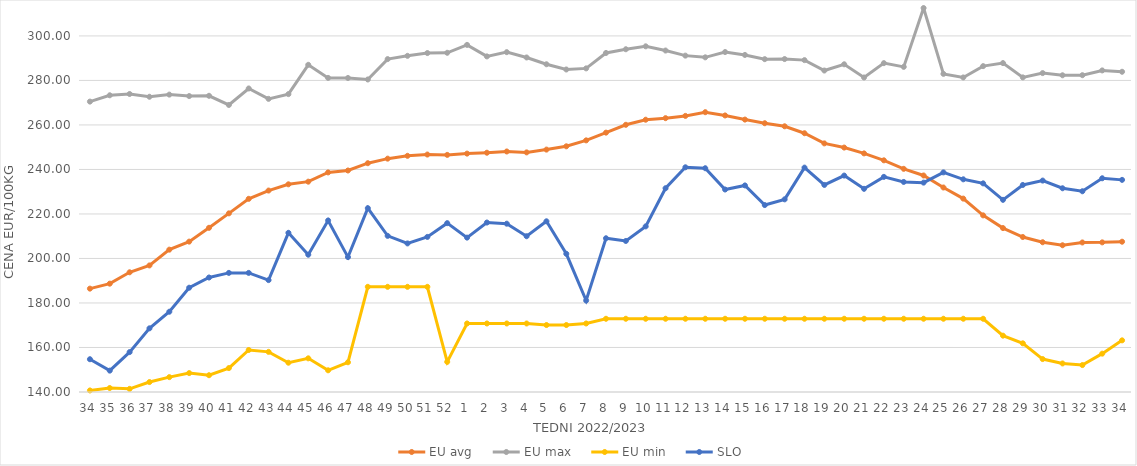
| Category | EU avg | EU max | EU min | SLO |
|---|---|---|---|---|
| 34.0 | 186.448 | 270.49 | 140.7 | 154.73 |
| 35.0 | 188.684 | 273.33 | 141.78 | 149.6 |
| 36.0 | 193.792 | 273.91 | 141.41 | 157.93 |
| 37.0 | 196.877 | 272.67 | 144.47 | 168.61 |
| 38.0 | 203.962 | 273.63 | 146.68 | 176.07 |
| 39.0 | 207.574 | 272.98 | 148.499 | 186.86 |
| 40.0 | 213.785 | 273.1 | 147.54 | 191.45 |
| 41.0 | 220.272 | 268.98 | 150.75 | 193.52 |
| 42.0 | 226.803 | 276.39 | 158.87 | 193.52 |
| 43.0 | 230.521 | 271.72 | 158.04 | 190.28 |
| 44.0 | 233.325 | 273.856 | 153.16 | 211.53 |
| 45.0 | 234.517 | 287.021 | 155.13 | 201.69 |
| 46.0 | 238.669 | 281.133 | 149.75 | 217.08 |
| 47.0 | 239.534 | 281.102 | 153.36 | 200.62 |
| 48.0 | 242.81 | 280.434 | 187.26 | 222.61 |
| 49.0 | 244.854 | 289.585 | 187.26 | 210.16 |
| 50.0 | 246.132 | 291.057 | 187.26 | 206.76 |
| 51.0 | 246.705 | 292.307 | 187.26 | 209.69 |
| 52.0 | 246.546 | 292.426 | 153.54 | 215.87 |
| 1.0 | 247.118 | 295.98 | 170.79 | 209.37 |
| 2.0 | 247.516 | 290.8 | 170.79 | 216.15 |
| 3.0 | 248.079 | 292.71 | 170.79 | 215.63 |
| 4.0 | 247.672 | 290.32 | 170.79 | 210 |
| 5.0 | 248.924 | 287.27 | 170.09 | 216.7 |
| 6.0 | 250.4 | 284.92 | 170.09 | 202.1 |
| 7.0 | 253.074 | 285.42 | 170.79 | 181.11 |
| 8.0 | 256.543 | 292.35 | 172.91 | 209.08 |
| 9.0 | 260.066 | 294.02 | 172.91 | 207.87 |
| 10.0 | 262.352 | 295.33 | 172.91 | 214.42 |
| 11.0 | 263.049 | 293.44 | 172.91 | 231.56 |
| 12.0 | 264.068 | 291.15 | 172.91 | 240.97 |
| 13.0 | 265.73 | 290.38 | 172.91 | 240.55 |
| 14.0 | 264.262 | 292.763 | 172.91 | 230.99 |
| 15.0 | 262.411 | 291.46 | 172.91 | 232.82 |
| 16.0 | 260.77 | 289.56 | 172.91 | 224 |
| 17.0 | 259.395 | 289.61 | 172.91 | 226.57 |
| 18.0 | 256.275 | 289.13 | 172.91 | 240.83 |
| 19.0 | 251.716 | 284.45 | 172.91 | 233.05 |
| 20.0 | 249.836 | 287.26 | 172.91 | 237.25 |
| 21.0 | 247.212 | 281.33 | 172.91 | 231.3 |
| 22.0 | 244.103 | 287.77 | 172.91 | 236.67 |
| 23.0 | 240.279 | 286.1 | 172.91 | 234.39 |
| 24.0 | 237.289 | 312.54 | 172.91 | 234.08 |
| 25.0 | 231.895 | 282.95 | 172.91 | 238.69 |
| 26.0 | 226.903 | 281.34 | 172.91 | 235.57 |
| 27.0 | 219.368 | 286.43 | 172.91 | 233.75 |
| 28.0 | 213.659 | 287.8 | 165.32 | 226.35 |
| 29.0 | 209.648 | 281.37 | 161.87 | 233.03 |
| 30.0 | 207.297 | 283.3 | 154.8 | 235 |
| 31.0 | 205.939 | 282.32 | 152.83 | 231.55 |
| 32.0 | 207.193 | 282.36 | 152.1 | 230.2 |
| 33.0 | 207.238 | 284.5 | 157.23 | 236.04 |
| 34.0 | 207.534 | 283.9 | 163.21 | 235.32 |